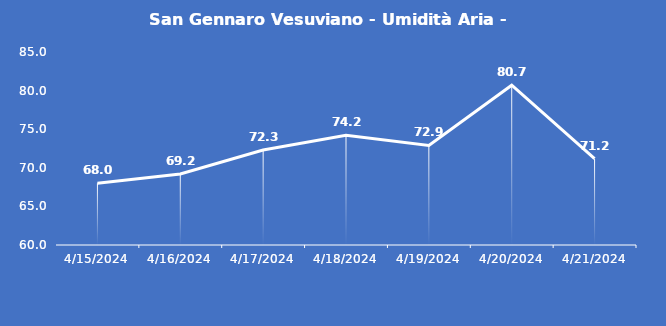
| Category | San Gennaro Vesuviano - Umidità Aria - Grezzo (%) |
|---|---|
| 4/15/24 | 68 |
| 4/16/24 | 69.2 |
| 4/17/24 | 72.3 |
| 4/18/24 | 74.2 |
| 4/19/24 | 72.9 |
| 4/20/24 | 80.7 |
| 4/21/24 | 71.2 |